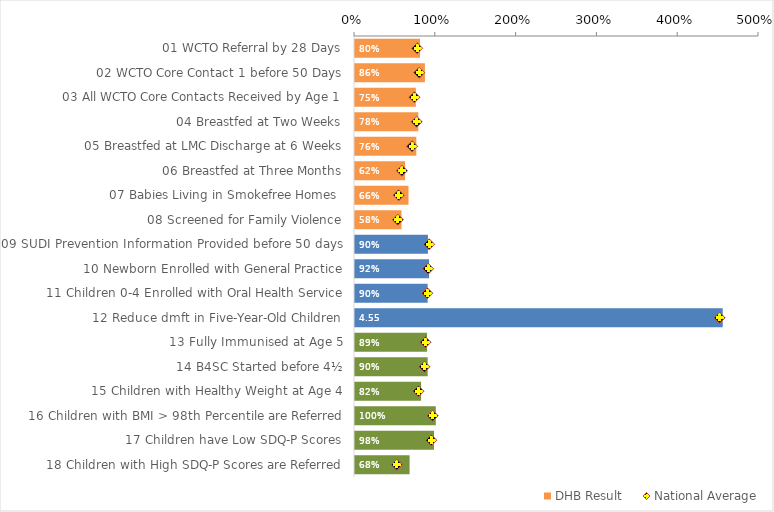
| Category | DHB Result |
|---|---|
| 01 WCTO Referral by 28 Days | 0.805 |
| 02 WCTO Core Contact 1 before 50 Days | 0.865 |
| 03 All WCTO Core Contacts Received by Age 1 | 0.753 |
| 04 Breastfed at Two Weeks | 0.784 |
| 05 Breastfed at LMC Discharge at 6 Weeks | 0.759 |
| 06 Breastfed at Three Months | 0.619 |
| 07 Babies Living in Smokefree Homes  | 0.662 |
| 08 Screened for Family Violence | 0.576 |
| 09 SUDI Prevention Information Provided before 50 days | 0.903 |
| 10 Newborn Enrolled with General Practice | 0.917 |
| 11 Children 0-4 Enrolled with Oral Health Service | 0.899 |
| 12 Reduce dmft in Five-Year-Old Children | 4.551 |
| 13 Fully Immunised at Age 5 | 0.891 |
| 14 B4SC Started before 4½ | 0.9 |
| 15 Children with Healthy Weight at Age 4 | 0.818 |
| 16 Children with BMI > 98th Percentile are Referred | 1 |
| 17 Children have Low SDQ-P Scores | 0.978 |
| 18 Children with High SDQ-P Scores are Referred | 0.676 |